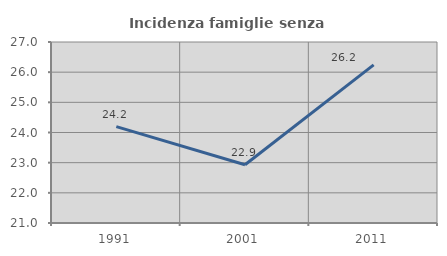
| Category | Incidenza famiglie senza nuclei |
|---|---|
| 1991.0 | 24.196 |
| 2001.0 | 22.931 |
| 2011.0 | 26.24 |